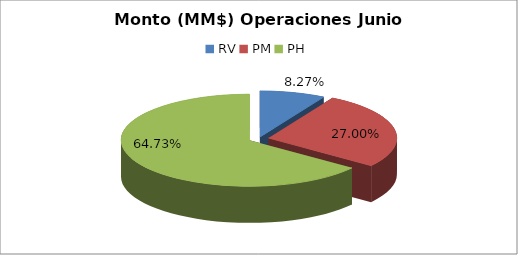
| Category | Series 0 |
|---|---|
| RV | 1187018.073 |
| PM | 3874404.728 |
| PH | 9290296.839 |